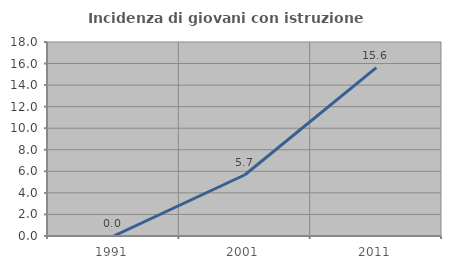
| Category | Incidenza di giovani con istruzione universitaria |
|---|---|
| 1991.0 | 0 |
| 2001.0 | 5.682 |
| 2011.0 | 15.625 |